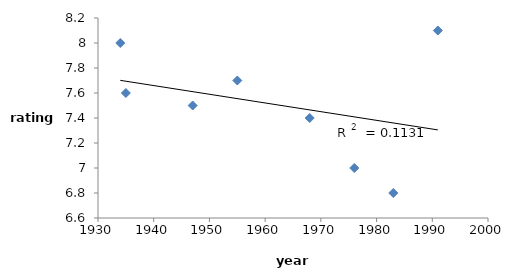
| Category | Series 0 |
|---|---|
| 1991.0 | 8.1 |
| 1983.0 | 6.8 |
| 1976.0 | 7 |
| 1968.0 | 7.4 |
| 1955.0 | 7.7 |
| 1947.0 | 7.5 |
| 1935.0 | 7.6 |
| 1934.0 | 8 |